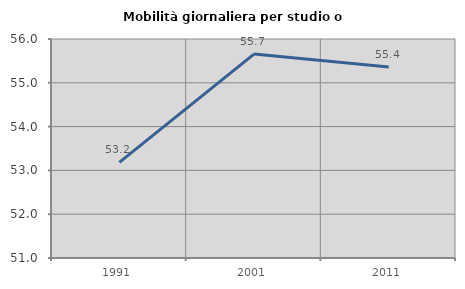
| Category | Mobilità giornaliera per studio o lavoro |
|---|---|
| 1991.0 | 53.182 |
| 2001.0 | 55.656 |
| 2011.0 | 55.36 |